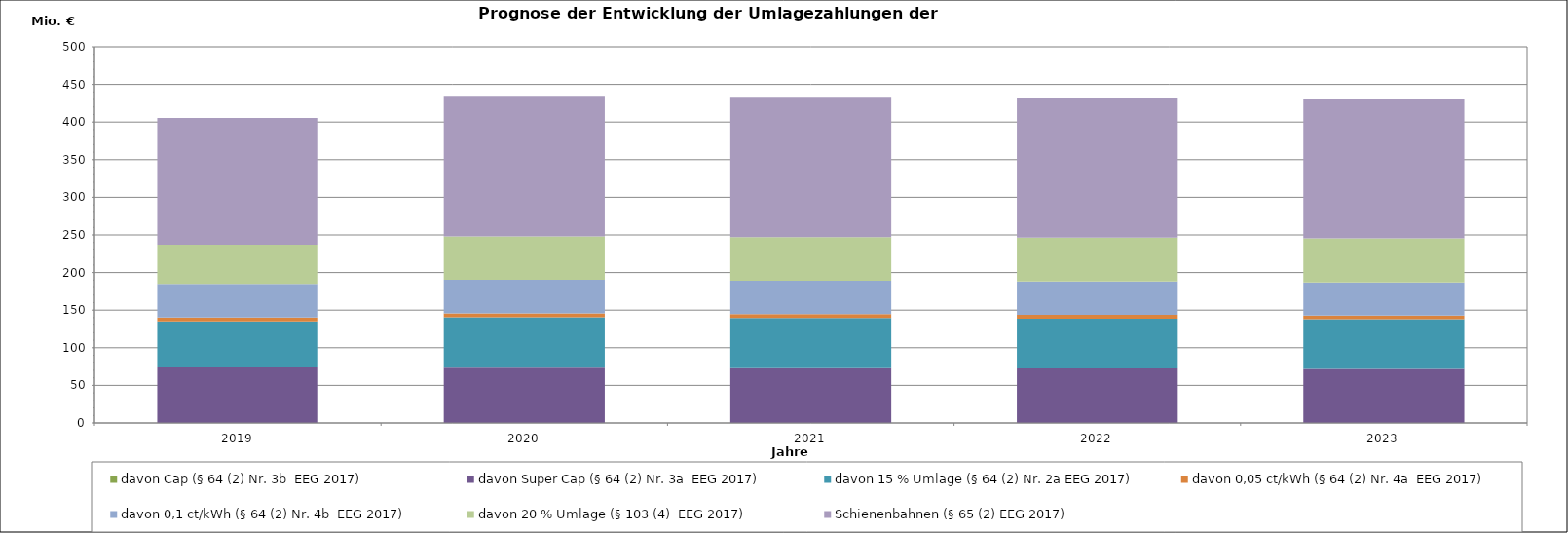
| Category |  davon Cap (§ 64 (2) Nr. 3b  EEG 2017)  |  davon Super Cap (§ 64 (2) Nr. 3a  EEG 2017)  |  davon 15 % Umlage (§ 64 (2) Nr. 2a EEG 2017)  |  davon 0,05 ct/kWh (§ 64 (2) Nr. 4a  EEG 2017)  |  davon 0,1 ct/kWh (§ 64 (2) Nr. 4b  EEG 2017)  |  davon 20 % Umlage (§ 103 (4)  EEG 2017)  |  Schienenbahnen (§ 65 (2) EEG 2017)  |
|---|---|---|---|---|---|---|---|
| 2019.0 | 0 | 73.941 | 61.077 | 5.071 | 44.843 | 52.067 | 168.398 |
| 2020.0 | 0 | 73.484 | 67.072 | 5.049 | 44.648 | 57.78 | 185.554 |
| 2021.0 | 0 | 73 | 66.649 | 5.028 | 44.46 | 58.028 | 185.238 |
| 2022.0 | 0 | 72.51 | 66.219 | 5.005 | 44.262 | 58.29 | 184.9 |
| 2023.0 | 0 | 72.021 | 65.789 | 4.982 | 44.059 | 58.559 | 184.506 |